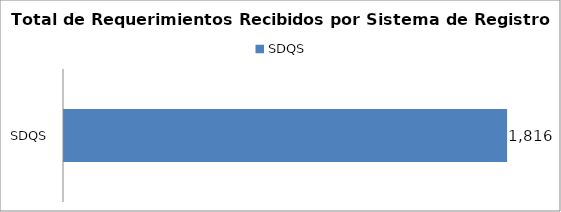
| Category | Total |
|---|---|
| SDQS | 1816 |